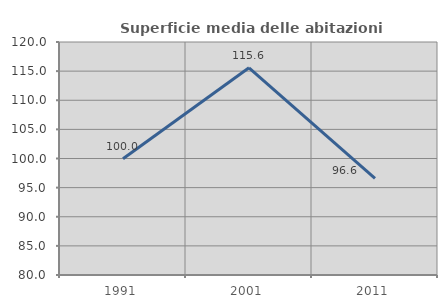
| Category | Superficie media delle abitazioni occupate |
|---|---|
| 1991.0 | 99.967 |
| 2001.0 | 115.573 |
| 2011.0 | 96.571 |